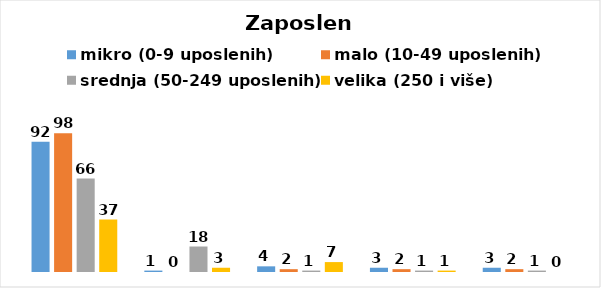
| Category | mikro (0-9 uposlenih) | malo (10-49 uposlenih) | srednja (50-249 uposlenih) | velika (250 i više) |
|---|---|---|---|---|
| 0 | 92 | 98 | 66 | 37 |
| 1 | 1 | 0 | 18 | 3 |
| 2 | 4 | 2 | 1 | 7 |
| 3 | 3 | 2 | 1 | 1 |
| 4 | 3 | 2 | 1 | 0 |